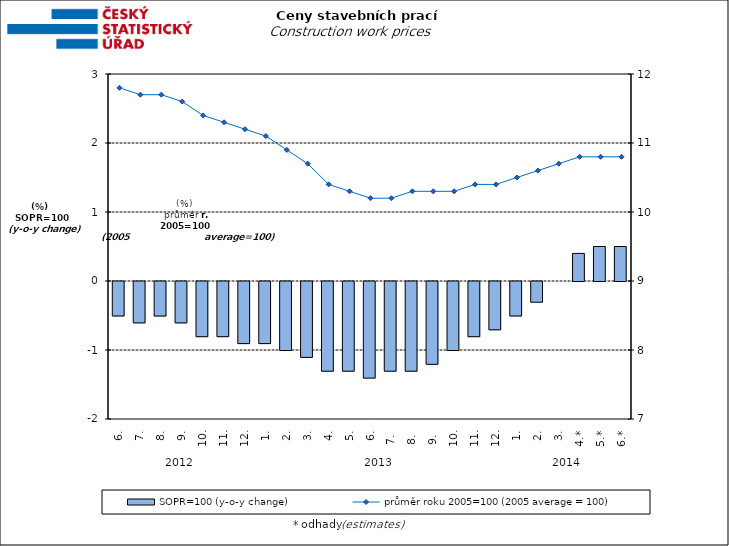
| Category | SOPR=100 (y-o-y change)   |
|---|---|
| 0 | -0.5 |
| 1 | -0.6 |
| 2 | -0.5 |
| 3 | -0.6 |
| 4 | -0.8 |
| 5 | -0.8 |
| 6 | -0.9 |
| 7 | -0.9 |
| 8 | -1 |
| 9 | -1.1 |
| 10 | -1.3 |
| 11 | -1.3 |
| 12 | -1.4 |
| 13 | -1.3 |
| 14 | -1.3 |
| 15 | -1.2 |
| 16 | -1 |
| 17 | -0.8 |
| 18 | -0.7 |
| 19 | -0.5 |
| 20 | -0.3 |
| 21 | 0 |
| 22 | 0.4 |
| 23 | 0.5 |
| 24 | 0.5 |